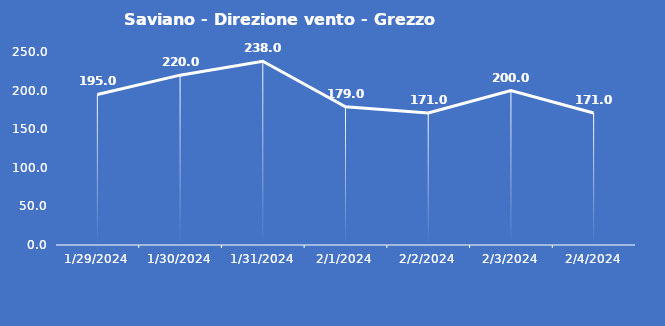
| Category | Saviano - Direzione vento - Grezzo (°N) |
|---|---|
| 1/29/24 | 195 |
| 1/30/24 | 220 |
| 1/31/24 | 238 |
| 2/1/24 | 179 |
| 2/2/24 | 171 |
| 2/3/24 | 200 |
| 2/4/24 | 171 |